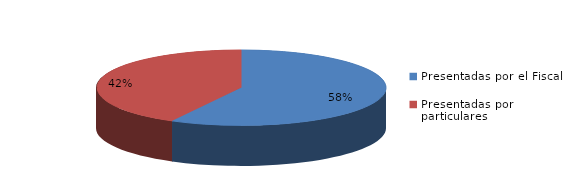
| Category | Series 0 |
|---|---|
| Presentadas por el Fiscal | 114 |
| Presentadas por particulares | 83 |